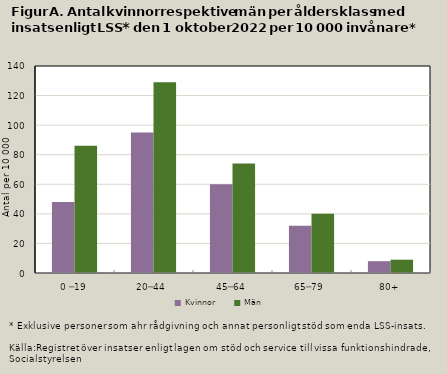
| Category | Kvinnor | Män |
|---|---|---|
| 0 ─19 | 48 | 86 |
| 20─44 | 95 | 129 |
| 45─64 | 60 | 74 |
| 65─79 | 32 | 40 |
| 80+ | 8 | 9 |